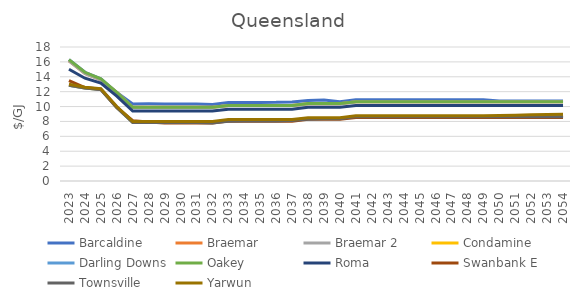
| Category | Barcaldine | Braemar | Braemar 2 | Condamine | Darling Downs | Oakey | Roma | Swanbank E | Townsville | Yarwun |
|---|---|---|---|---|---|---|---|---|---|---|
| 2023.0 | 16.303 | 16.152 | 16.152 | 12.872 | 12.872 | 16.303 | 15.009 | 13.489 | 12.872 | 12.983 |
| 2024.0 | 14.603 | 14.44 | 14.44 | 12.485 | 12.485 | 14.603 | 13.809 | 12.55 | 12.485 | 12.596 |
| 2025.0 | 13.737 | 13.592 | 13.592 | 12.28 | 12.28 | 13.737 | 13.166 | 12.327 | 12.28 | 12.391 |
| 2026.0 | 11.879 | 11.889 | 11.889 | 9.897 | 9.897 | 11.897 | 11.397 | 9.87 | 9.879 | 10.008 |
| 2027.0 | 10.353 | 9.893 | 9.893 | 7.897 | 7.897 | 9.897 | 9.397 | 8.09 | 7.86 | 8.008 |
| 2028.0 | 10.368 | 9.896 | 9.896 | 7.897 | 7.897 | 9.897 | 9.397 | 7.925 | 7.874 | 8.008 |
| 2029.0 | 10.352 | 9.892 | 9.892 | 7.897 | 7.897 | 9.897 | 9.397 | 7.792 | 7.859 | 8.008 |
| 2030.0 | 10.357 | 9.892 | 9.892 | 7.897 | 7.897 | 9.897 | 9.397 | 7.792 | 7.863 | 8.008 |
| 2031.0 | 10.341 | 9.892 | 9.892 | 7.897 | 7.897 | 9.897 | 9.397 | 7.792 | 7.849 | 8.008 |
| 2032.0 | 10.292 | 9.892 | 9.892 | 7.897 | 7.897 | 9.897 | 9.397 | 7.792 | 7.802 | 8.008 |
| 2033.0 | 10.543 | 10.138 | 10.138 | 8.147 | 8.147 | 10.147 | 9.647 | 8.042 | 8.041 | 8.258 |
| 2034.0 | 10.547 | 10.141 | 10.141 | 8.147 | 8.147 | 10.147 | 9.647 | 8.042 | 8.045 | 8.258 |
| 2035.0 | 10.558 | 10.141 | 10.141 | 8.147 | 8.147 | 10.147 | 9.647 | 8.042 | 8.055 | 8.258 |
| 2036.0 | 10.562 | 10.141 | 10.141 | 8.147 | 8.147 | 10.147 | 9.647 | 8.042 | 8.059 | 8.258 |
| 2037.0 | 10.616 | 10.138 | 10.138 | 8.147 | 8.147 | 10.147 | 9.647 | 8.042 | 8.111 | 8.258 |
| 2038.0 | 10.827 | 10.387 | 10.387 | 8.397 | 8.397 | 10.397 | 9.897 | 8.292 | 8.312 | 8.508 |
| 2039.0 | 10.876 | 10.391 | 10.391 | 8.397 | 8.397 | 10.397 | 9.897 | 8.292 | 8.358 | 8.508 |
| 2040.0 | 10.635 | 10.391 | 10.391 | 8.397 | 8.397 | 10.397 | 9.897 | 8.292 | 8.375 | 8.508 |
| 2041.0 | 10.912 | 10.639 | 10.639 | 8.647 | 8.647 | 10.647 | 10.147 | 8.542 | 8.646 | 8.758 |
| 2042.0 | 10.913 | 10.641 | 10.641 | 8.647 | 8.647 | 10.647 | 10.147 | 8.542 | 8.646 | 8.758 |
| 2043.0 | 10.913 | 10.639 | 10.639 | 8.647 | 8.647 | 10.647 | 10.147 | 8.542 | 8.646 | 8.758 |
| 2044.0 | 10.913 | 10.639 | 10.639 | 8.647 | 8.647 | 10.647 | 10.147 | 8.542 | 8.646 | 8.758 |
| 2045.0 | 10.913 | 10.635 | 10.635 | 8.647 | 8.647 | 10.647 | 10.147 | 8.542 | 8.646 | 8.758 |
| 2046.0 | 10.913 | 10.635 | 10.635 | 8.647 | 8.647 | 10.647 | 10.147 | 8.542 | 8.646 | 8.758 |
| 2047.0 | 10.913 | 10.634 | 10.634 | 8.647 | 8.647 | 10.647 | 10.147 | 8.541 | 8.646 | 8.758 |
| 2048.0 | 10.913 | 10.634 | 10.634 | 8.647 | 8.647 | 10.647 | 10.147 | 8.54 | 8.646 | 8.758 |
| 2049.0 | 10.913 | 10.637 | 10.637 | 8.647 | 8.647 | 10.647 | 10.147 | 8.538 | 8.646 | 8.758 |
| 2050.0 | 10.753 | 10.636 | 10.636 | 8.647 | 8.647 | 10.647 | 10.147 | 8.538 | 8.646 | 8.802 |
| 2051.0 | 10.753 | 10.636 | 10.636 | 8.647 | 8.647 | 10.647 | 10.147 | 8.537 | 8.646 | 8.846 |
| 2052.0 | 10.753 | 10.635 | 10.635 | 8.647 | 8.647 | 10.647 | 10.147 | 8.536 | 8.646 | 8.89 |
| 2053.0 | 10.753 | 10.635 | 10.635 | 8.647 | 8.647 | 10.647 | 10.147 | 8.535 | 8.646 | 8.934 |
| 2054.0 | 10.753 | 10.634 | 10.634 | 8.647 | 8.647 | 10.647 | 10.147 | 8.534 | 8.646 | 8.979 |